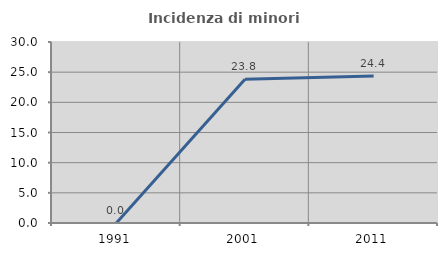
| Category | Incidenza di minori stranieri |
|---|---|
| 1991.0 | 0 |
| 2001.0 | 23.841 |
| 2011.0 | 24.374 |